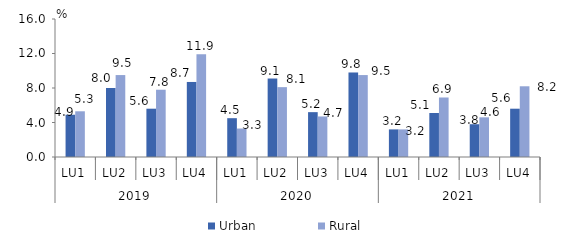
| Category | Urban | Rural |
|---|---|---|
| 0 | 4.9 | 5.3 |
| 1 | 8 | 9.5 |
| 2 | 5.6 | 7.8 |
| 3 | 8.7 | 11.9 |
| 4 | 4.5 | 3.3 |
| 5 | 9.1 | 8.1 |
| 6 | 5.2 | 4.7 |
| 7 | 9.8 | 9.5 |
| 8 | 3.2 | 3.2 |
| 9 | 5.1 | 6.9 |
| 10 | 3.8 | 4.6 |
| 11 | 5.6 | 8.2 |